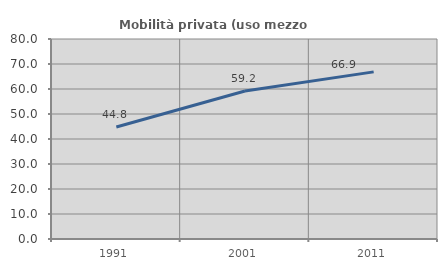
| Category | Mobilità privata (uso mezzo privato) |
|---|---|
| 1991.0 | 44.8 |
| 2001.0 | 59.204 |
| 2011.0 | 66.851 |